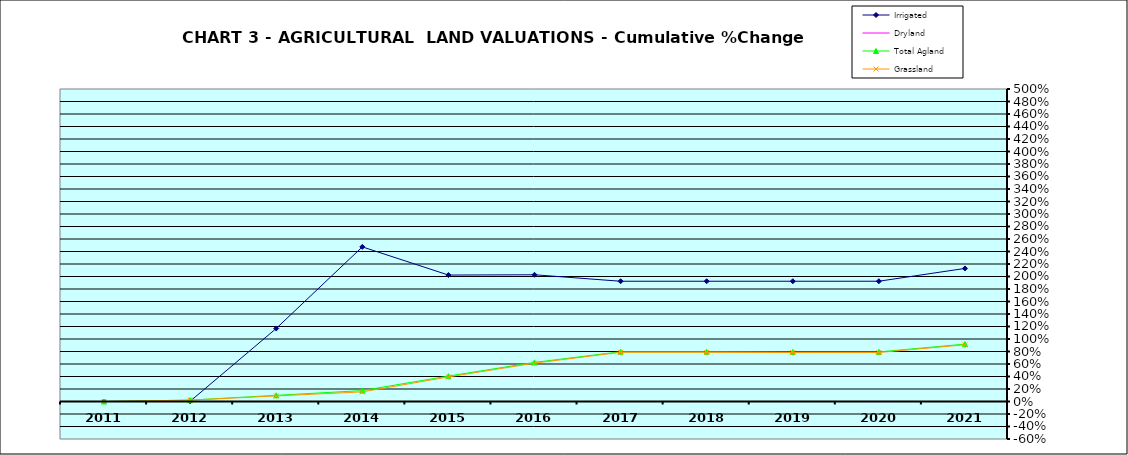
| Category | Irrigated | Dryland | Total Agland | Grassland |
|---|---|---|---|---|
| 2011.0 | 0 | 0 | 0 | 0 |
| 2012.0 | 0.004 | 0 | 0.022 | 0.022 |
| 2013.0 | 1.169 | 0 | 0.099 | 0.089 |
| 2014.0 | 2.474 | 0 | 0.174 | 0.154 |
| 2015.0 | 2.023 | 0 | 0.407 | 0.393 |
| 2016.0 | 2.028 | 0 | 0.626 | 0.614 |
| 2017.0 | 1.924 | 0 | 0.796 | 0.787 |
| 2018.0 | 1.924 | 0 | 0.796 | 0.787 |
| 2019.0 | 1.924 | 0 | 0.793 | 0.783 |
| 2020.0 | 1.924 | 0 | 0.793 | 0.784 |
| 2021.0 | 2.129 | 0 | 0.918 | 0.908 |